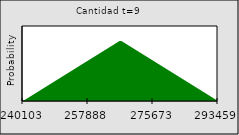
| Category | Series 0 |
|---|---|
| 240102.710882089 | 0 |
| nan | 0 |
| nan | 0.001 |
| nan | 0.001 |
| nan | 0.002 |
| nan | 0.002 |
| nan | 0.002 |
| nan | 0.003 |
| nan | 0.003 |
| nan | 0.004 |
| nan | 0.004 |
| nan | 0.004 |
| nan | 0.005 |
| nan | 0.005 |
| nan | 0.006 |
| nan | 0.006 |
| nan | 0.007 |
| nan | 0.007 |
| nan | 0.007 |
| nan | 0.008 |
| nan | 0.008 |
| nan | 0.009 |
| nan | 0.009 |
| nan | 0.009 |
| nan | 0.01 |
| nan | 0.01 |
| nan | 0.011 |
| nan | 0.011 |
| nan | 0.011 |
| nan | 0.012 |
| nan | 0.012 |
| nan | 0.013 |
| nan | 0.013 |
| 257888.09687335466 | 0.013 |
| nan | 0.014 |
| nan | 0.014 |
| nan | 0.015 |
| nan | 0.015 |
| nan | 0.016 |
| nan | 0.016 |
| nan | 0.016 |
| nan | 0.017 |
| nan | 0.017 |
| nan | 0.018 |
| nan | 0.018 |
| nan | 0.018 |
| nan | 0.019 |
| nan | 0.019 |
| nan | 0.02 |
| nan | 0.02 |
| nan | 0.02 |
| nan | 0.02 |
| nan | 0.019 |
| nan | 0.019 |
| nan | 0.018 |
| nan | 0.018 |
| nan | 0.018 |
| nan | 0.017 |
| nan | 0.017 |
| nan | 0.016 |
| nan | 0.016 |
| nan | 0.016 |
| nan | 0.015 |
| nan | 0.015 |
| nan | 0.014 |
| nan | 0.014 |
| 275673.48286462034 | 0.013 |
| nan | 0.013 |
| nan | 0.013 |
| nan | 0.012 |
| nan | 0.012 |
| nan | 0.011 |
| nan | 0.011 |
| nan | 0.011 |
| nan | 0.01 |
| nan | 0.01 |
| nan | 0.009 |
| nan | 0.009 |
| nan | 0.009 |
| nan | 0.008 |
| nan | 0.008 |
| nan | 0.007 |
| nan | 0.007 |
| nan | 0.007 |
| nan | 0.006 |
| nan | 0.006 |
| nan | 0.005 |
| nan | 0.005 |
| nan | 0.004 |
| nan | 0.004 |
| nan | 0.004 |
| nan | 0.003 |
| nan | 0.003 |
| nan | 0.002 |
| nan | 0.002 |
| nan | 0.002 |
| nan | 0.001 |
| nan | 0.001 |
| nan | 0 |
| 293458.868855886 | 0 |